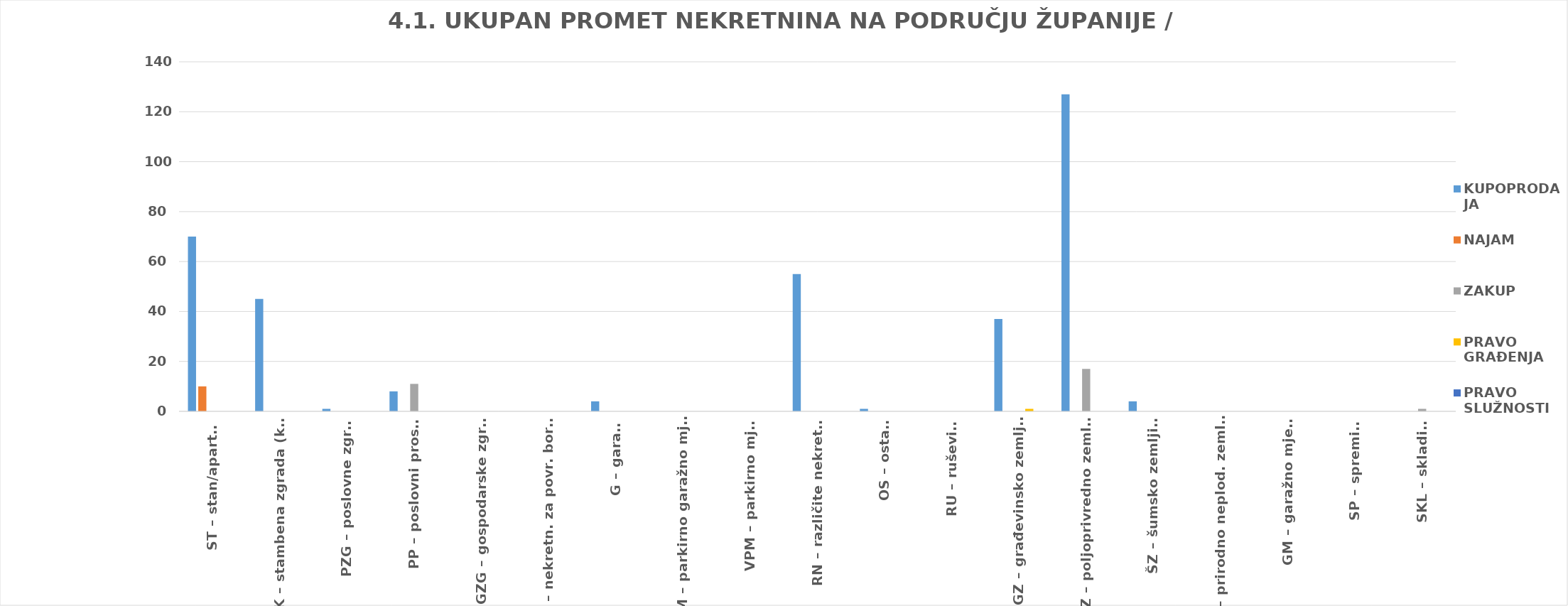
| Category | KUPOPRODAJA | NAJAM | ZAKUP | PRAVO GRAĐENJA | PRAVO SLUŽNOSTI |
|---|---|---|---|---|---|
| ST – stan/apartman | 70 | 10 | 0 | 0 | 0 |
| OK – stambena zgrada (kuća) | 45 | 0 | 0 | 0 | 0 |
| PZG – poslovne zgrade | 1 | 0 | 0 | 0 | 0 |
| PP – poslovni prostori | 8 | 0 | 11 | 0 | 0 |
| GZG – gospodarske zgrade | 0 | 0 | 0 | 0 | 0 |
| VIK – nekretn. za povr. boravak | 0 | 0 | 0 | 0 | 0 |
| G – garaža | 4 | 0 | 0 | 0 | 0 |
| PGM – parkirno garažno mjesto | 0 | 0 | 0 | 0 | 0 |
| VPM – parkirno mjesto | 0 | 0 | 0 | 0 | 0 |
| RN – različite nekretnine | 55 | 0 | 0 | 0 | 0 |
| OS – ostalo | 1 | 0 | 0 | 0 | 0 |
| RU – ruševine | 0 | 0 | 0 | 0 | 0 |
| GZ – građevinsko zemljište | 37 | 0 | 0 | 1 | 0 |
| PZ – poljoprivredno zemljište | 127 | 0 | 17 | 0 | 0 |
| ŠZ – šumsko zemljište | 4 | 0 | 0 | 0 | 0 |
| PNZ – prirodno neplod. zemljište | 0 | 0 | 0 | 0 | 0 |
| GM – garažno mjesto | 0 | 0 | 0 | 0 | 0 |
| SP – spremište | 0 | 0 | 0 | 0 | 0 |
| SKL – skladište | 0 | 0 | 1 | 0 | 0 |